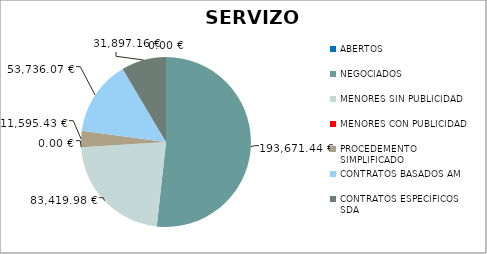
| Category | Series 0 |
|---|---|
| ABERTOS  | 0 |
| NEGOCIADOS  | 193671.44 |
| MENORES SIN PUBLICIDAD | 83419.98 |
| MENORES CON PUBLICIDAD | 0 |
| PROCEDEMENTO SIMPLIFICADO | 11595.43 |
| CONTRATOS BASADOS AM | 53736.07 |
| CONTRATOS ESPECÍFICOS SDA | 31897.16 |